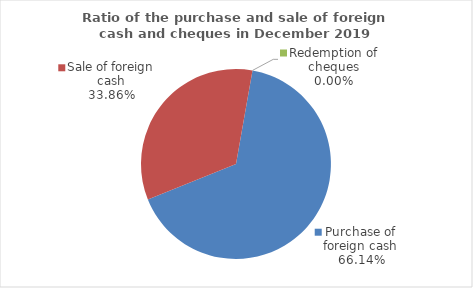
| Category | Series 0 |
|---|---|
| Purchase of foreign cash | 66.142 |
| Sale of foreign cash | 33.858 |
| Redemption of cheques | 0 |